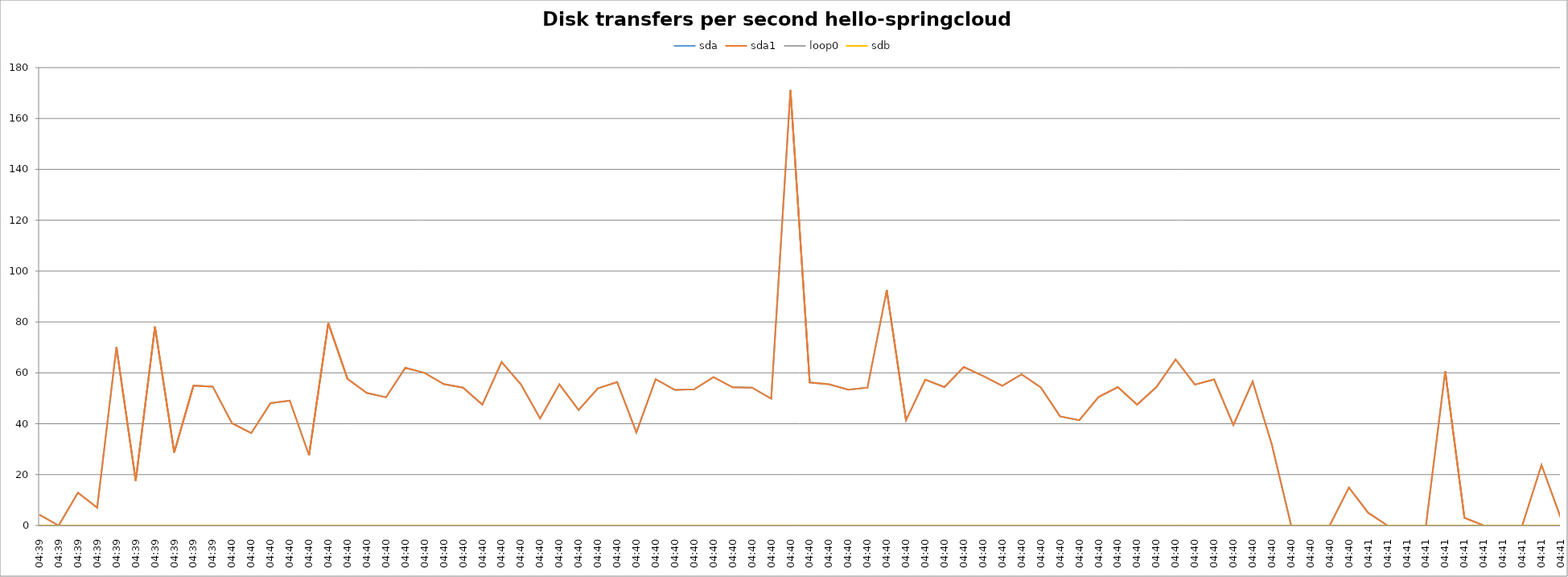
| Category | sda | sda1 | loop0 | sdb |
|---|---|---|---|---|
| 04:39 | 4.2 | 4.2 | 0 | 0 |
| 04:39 | 0 | 0 | 0 | 0 |
| 04:39 | 12.9 | 12.9 | 0 | 0 |
| 04:39 | 7 | 7 | 0 | 0 |
| 04:39 | 70.1 | 70.1 | 0 | 0 |
| 04:39 | 17.6 | 17.6 | 0 | 0 |
| 04:39 | 78.2 | 78.2 | 0 | 0 |
| 04:39 | 28.7 | 28.7 | 0 | 0 |
| 04:39 | 55 | 55 | 0 | 0 |
| 04:39 | 54.6 | 54.6 | 0 | 0 |
| 04:40 | 40.2 | 40.2 | 0 | 0 |
| 04:40 | 36.3 | 36.3 | 0 | 0 |
| 04:40 | 48.1 | 48.1 | 0 | 0 |
| 04:40 | 49.1 | 49.1 | 0 | 0 |
| 04:40 | 27.6 | 27.6 | 0 | 0 |
| 04:40 | 79.5 | 79.5 | 0 | 0 |
| 04:40 | 57.6 | 57.6 | 0 | 0 |
| 04:40 | 52.1 | 52.1 | 0 | 0 |
| 04:40 | 50.4 | 50.4 | 0 | 0 |
| 04:40 | 62 | 62 | 0 | 0 |
| 04:40 | 60 | 60 | 0 | 0 |
| 04:40 | 55.6 | 55.6 | 0 | 0 |
| 04:40 | 54.2 | 54.2 | 0 | 0 |
| 04:40 | 47.5 | 47.5 | 0 | 0 |
| 04:40 | 64.3 | 64.3 | 0 | 0 |
| 04:40 | 55.5 | 55.5 | 0 | 0 |
| 04:40 | 42.1 | 42.1 | 0 | 0 |
| 04:40 | 55.5 | 55.5 | 0 | 0 |
| 04:40 | 45.4 | 45.4 | 0 | 0 |
| 04:40 | 53.9 | 53.9 | 0 | 0 |
| 04:40 | 56.4 | 56.4 | 0 | 0 |
| 04:40 | 36.6 | 36.6 | 0 | 0 |
| 04:40 | 57.5 | 57.5 | 0 | 0 |
| 04:40 | 53.3 | 53.3 | 0 | 0 |
| 04:40 | 53.5 | 53.5 | 0 | 0 |
| 04:40 | 58.3 | 58.3 | 0 | 0 |
| 04:40 | 54.3 | 54.3 | 0 | 0 |
| 04:40 | 54.2 | 54.2 | 0 | 0 |
| 04:40 | 49.9 | 49.9 | 0 | 0 |
| 04:40 | 171.2 | 171.2 | 0 | 0 |
| 04:40 | 56.2 | 56.2 | 0 | 0 |
| 04:40 | 55.5 | 55.5 | 0 | 0 |
| 04:40 | 53.4 | 53.4 | 0 | 0 |
| 04:40 | 54.2 | 54.2 | 0 | 0 |
| 04:40 | 92.5 | 92.5 | 0 | 0 |
| 04:40 | 41.3 | 41.3 | 0 | 0 |
| 04:40 | 57.3 | 57.3 | 0 | 0 |
| 04:40 | 54.4 | 54.4 | 0 | 0 |
| 04:40 | 62.3 | 62.3 | 0 | 0 |
| 04:40 | 58.8 | 58.8 | 0 | 0 |
| 04:40 | 54.9 | 54.9 | 0 | 0 |
| 04:40 | 59.4 | 59.4 | 0 | 0 |
| 04:40 | 54.3 | 54.3 | 0 | 0 |
| 04:40 | 42.9 | 42.9 | 0 | 0 |
| 04:40 | 41.4 | 41.4 | 0 | 0 |
| 04:40 | 50.5 | 50.5 | 0 | 0 |
| 04:40 | 54.4 | 54.4 | 0 | 0 |
| 04:40 | 47.5 | 47.5 | 0 | 0 |
| 04:40 | 54.4 | 54.4 | 0 | 0 |
| 04:40 | 65.3 | 65.3 | 0 | 0 |
| 04:40 | 55.4 | 55.4 | 0 | 0 |
| 04:40 | 57.4 | 57.4 | 0 | 0 |
| 04:40 | 39.5 | 39.5 | 0 | 0 |
| 04:40 | 56.6 | 56.6 | 0 | 0 |
| 04:40 | 31.7 | 31.7 | 0 | 0 |
| 04:40 | 0 | 0 | 0 | 0 |
| 04:40 | 0 | 0 | 0 | 0 |
| 04:40 | 0 | 0 | 0 | 0 |
| 04:40 | 14.9 | 14.9 | 0 | 0 |
| 04:41 | 5 | 5 | 0 | 0 |
| 04:41 | 0 | 0 | 0 | 0 |
| 04:41 | 0 | 0 | 0 | 0 |
| 04:41 | 0 | 0 | 0 | 0 |
| 04:41 | 60.6 | 60.6 | 0 | 0 |
| 04:41 | 3 | 3 | 0 | 0 |
| 04:41 | 0 | 0 | 0 | 0 |
| 04:41 | 0 | 0 | 0 | 0 |
| 04:41 | 0 | 0 | 0 | 0 |
| 04:41 | 23.8 | 23.8 | 0 | 0 |
| 04:41 | 3 | 3 | 0 | 0 |